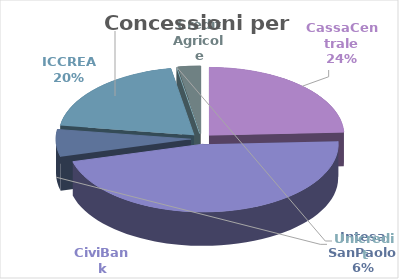
| Category | Series 0 |
|---|---|
| CassaCentrale | 27934500 |
| CiviBank | 53487765 |
| Intesa SanPaolo  | 7434000 |
| ICCREA | 22950000 |
| Unicredit | 0 |
| Credit Agricole | 3150000 |